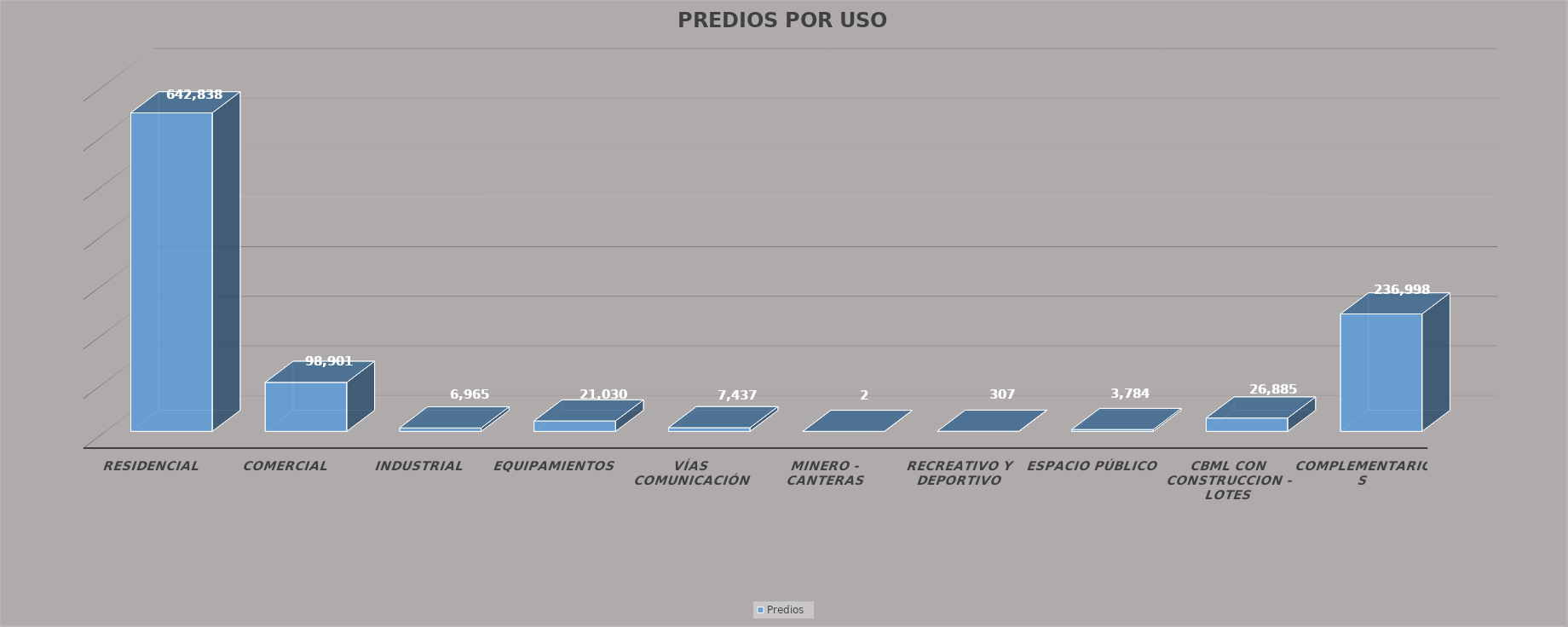
| Category | Predios |
|---|---|
| RESIDENCIAL | 642838 |
| COMERCIAL | 98901 |
| INDUSTRIAL | 6965 |
| EQUIPAMIENTOS | 21030 |
| VÍAS COMUNICACIÓN | 7437 |
| MINERO - CANTERAS | 2 |
| RECREATIVO Y DEPORTIVO | 307 |
| ESPACIO PÚBLICO | 3784 |
| CBML CON CONSTRUCCION - LOTES | 26885 |
| COMPLEMENTARIOS | 236998 |